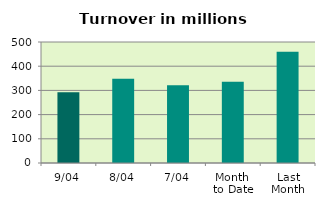
| Category | Series 0 |
|---|---|
| 9/04 | 292.683 |
| 8/04 | 347.786 |
| 7/04 | 321.32 |
| Month 
to Date | 335.495 |
| Last
Month | 459.546 |